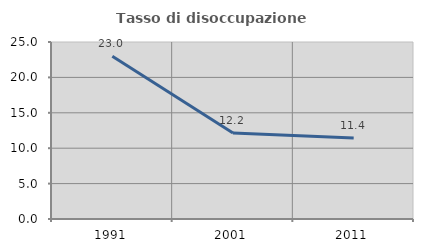
| Category | Tasso di disoccupazione giovanile  |
|---|---|
| 1991.0 | 22.989 |
| 2001.0 | 12.162 |
| 2011.0 | 11.429 |